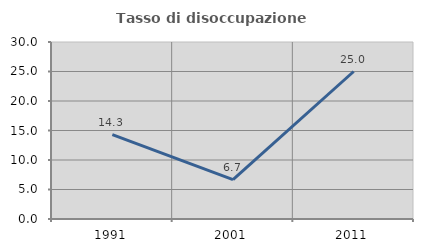
| Category | Tasso di disoccupazione giovanile  |
|---|---|
| 1991.0 | 14.286 |
| 2001.0 | 6.667 |
| 2011.0 | 25 |